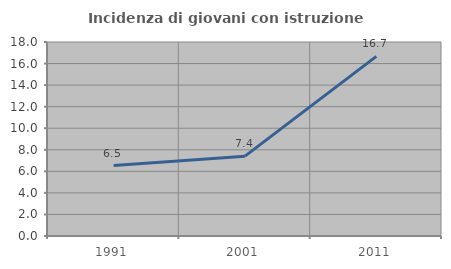
| Category | Incidenza di giovani con istruzione universitaria |
|---|---|
| 1991.0 | 6.536 |
| 2001.0 | 7.407 |
| 2011.0 | 16.667 |